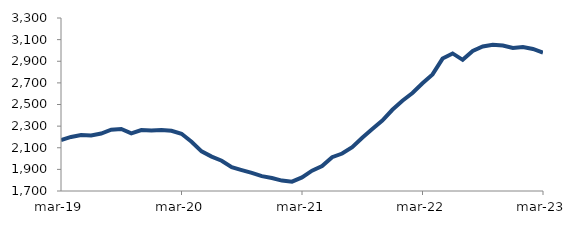
| Category | Series 0 |
|---|---|
| 2019-03-01 | 2171.077 |
| 2019-04-01 | 2199.941 |
| 2019-05-01 | 2218.125 |
| 2019-06-01 | 2213.708 |
| 2019-07-01 | 2231.834 |
| 2019-08-01 | 2267.321 |
| 2019-09-01 | 2273.768 |
| 2019-10-01 | 2233.304 |
| 2019-11-01 | 2263.898 |
| 2019-12-01 | 2259.926 |
| 2020-01-01 | 2265.053 |
| 2020-02-01 | 2256.766 |
| 2020-03-01 | 2229.161 |
| 2020-04-01 | 2155.791 |
| 2020-05-01 | 2066.843 |
| 2020-06-01 | 2018.026 |
| 2020-07-01 | 1979.558 |
| 2020-08-01 | 1920.368 |
| 2020-09-01 | 1893.237 |
| 2020-10-01 | 1867.4 |
| 2020-11-01 | 1837.195 |
| 2020-12-01 | 1819.546 |
| 2021-01-01 | 1796.45 |
| 2021-02-01 | 1786.603 |
| 2021-03-01 | 1826.072 |
| 2021-04-01 | 1887.798 |
| 2021-05-01 | 1930.372 |
| 2021-06-01 | 2012.926 |
| 2021-07-01 | 2046.434 |
| 2021-08-01 | 2105.806 |
| 2021-09-01 | 2192.514 |
| 2021-10-01 | 2272.972 |
| 2021-11-01 | 2351.334 |
| 2021-12-01 | 2451.171 |
| 2022-01-01 | 2534.613 |
| 2022-02-01 | 2606.357 |
| 2022-03-01 | 2696.948 |
| 2022-04-01 | 2778.264 |
| 2022-05-01 | 2924.682 |
| 2022-06-01 | 2972.281 |
| 2022-07-01 | 2912.933 |
| 2022-08-01 | 2994.913 |
| 2022-09-01 | 3036.467 |
| 2022-10-01 | 3052.236 |
| 2022-11-01 | 3044.767 |
| 2022-12-01 | 3023.141 |
| 2023-01-01 | 3030.956 |
| 2023-02-01 | 3013.674 |
| 2023-03-01 | 2979.861 |